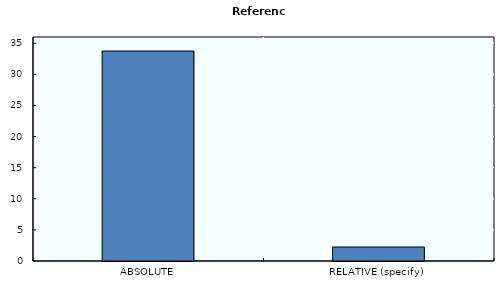
| Category | Reference |
|---|---|
| ABSOLUTE | 33.75 |
| RELATIVE (specify) | 2.25 |